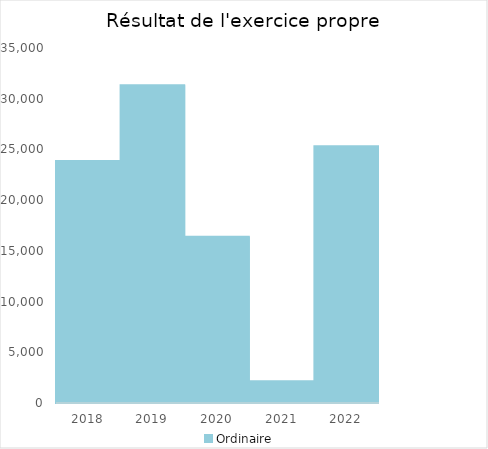
| Category |   | Ordinaire |    |
|---|---|---|---|
| 2018.0 |  | 23849.76 |  |
| 2019.0 |  | 31330.4 |  |
| 2020.0 |  | 16387.9 |  |
| 2021.0 |  | 2150.74 |  |
| 2022.0 |  | 25314.3 |  |